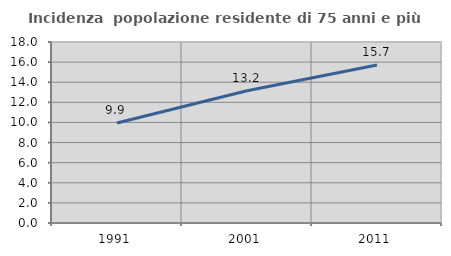
| Category | Incidenza  popolazione residente di 75 anni e più |
|---|---|
| 1991.0 | 9.945 |
| 2001.0 | 13.153 |
| 2011.0 | 15.706 |